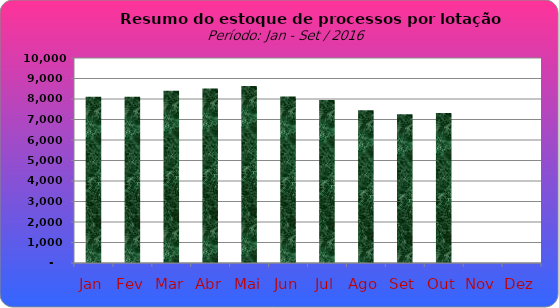
| Category | Series 0 |
|---|---|
| Jan | 8111 |
| Fev | 8114 |
| Mar | 8403 |
| Abr | 8512 |
| Mai | 8633 |
| Jun | 8120 |
| Jul | 7954 |
| Ago | 7447 |
| Set | 7258 |
| Out | 7313 |
| Nov | 0 |
| Dez | 0 |